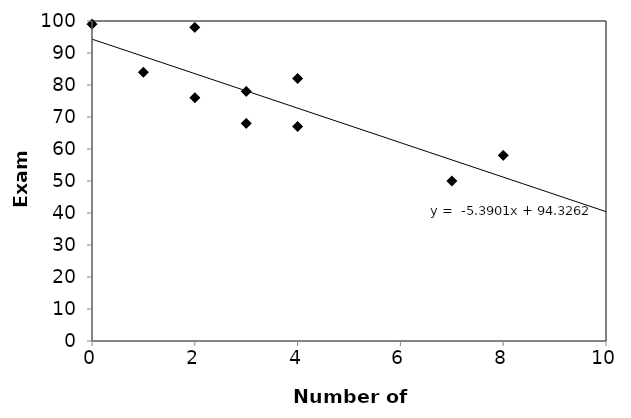
| Category | Exam Grade |
|---|---|
| 4.0 | 82 |
| 2.0 | 98 |
| 2.0 | 76 |
| 3.0 | 68 |
| 1.0 | 84 |
| 0.0 | 99 |
| 4.0 | 67 |
| 8.0 | 58 |
| 7.0 | 50 |
| 3.0 | 78 |